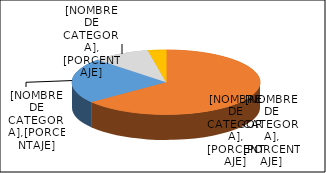
| Category | Series 0 |
|---|---|
| 0 | 11223 |
| 1 | 3943 |
| 2 | 1699 |
| 3 | 541 |